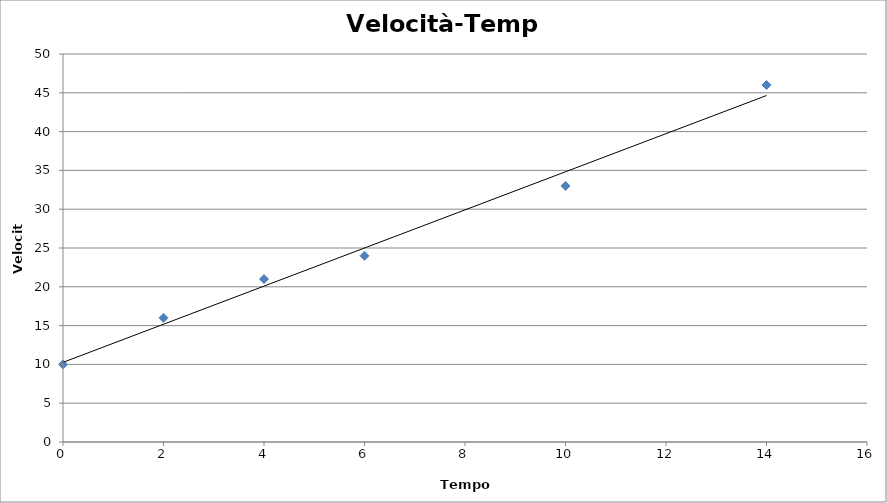
| Category | v |
|---|---|
| 0.0 | 10 |
| 2.0 | 16 |
| 4.0 | 21 |
| 6.0 | 24 |
| 10.0 | 33 |
| 14.0 | 46 |